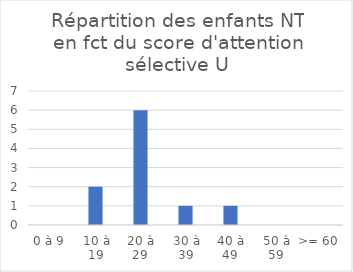
| Category | Series 0 |
|---|---|
| 0 à 9 | 0 |
| 10 à 19 | 2 |
| 20 à 29 | 6 |
| 30 à 39 | 1 |
| 40 à 49 | 1 |
| 50 à 59 | 0 |
| >= 60 | 0 |